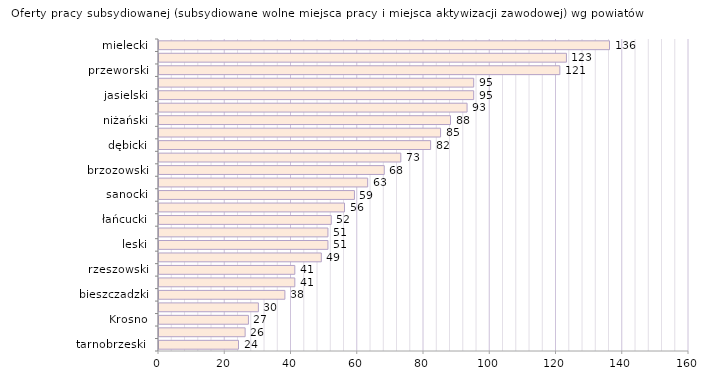
| Category | Oferty pracy subsydiowanej (subsydiowane wolne miejsca pracy i miejsca aktywizacji zawodowej) wg powiatów |
|---|---|
| tarnobrzeski  | 24 |
| krośnieński | 26 |
| Krosno | 27 |
| Tarnobrzeg | 30 |
| bieszczadzki | 38 |
| kolbuszowski | 41 |
| rzeszowski | 41 |
| przemyski | 49 |
| leski | 51 |
| lubaczowski | 51 |
| łańcucki | 52 |
| Przemyśl | 56 |
| sanocki | 59 |
| stalowowolski | 63 |
| brzozowski | 68 |
| Rzeszów | 73 |
| dębicki | 82 |
| leżajski | 85 |
| niżański | 88 |
| strzyżowski | 93 |
| jasielski | 95 |
| ropczycko-sędziszowski | 95 |
| przeworski | 121 |
| jarosławski | 123 |
| mielecki | 136 |